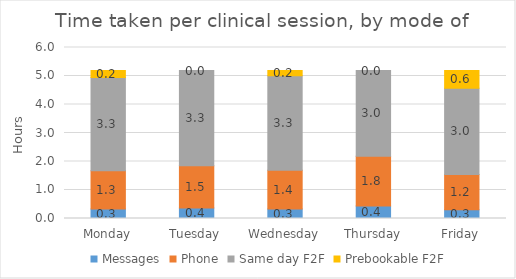
| Category | Messages | Phone | Same day F2F | Prebookable F2F |
|---|---|---|---|---|
| Monday | 0.333 | 1.341 | 3.271 | 0.245 |
| Tuesday | 0.368 | 1.482 | 3.339 | 0 |
| Wednesday | 0.337 | 1.357 | 3.311 | 0.183 |
| Thursday | 0.435 | 1.751 | 3.003 | 0 |
| Friday | 0.308 | 1.239 | 3.024 | 0.618 |